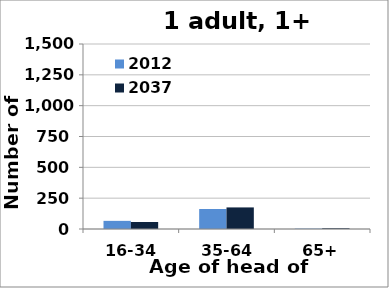
| Category | 2012 | 2037 |
|---|---|---|
| 16-34 | 66 | 57 |
| 35-64 | 162 | 175 |
| 65+ | 3 | 6 |